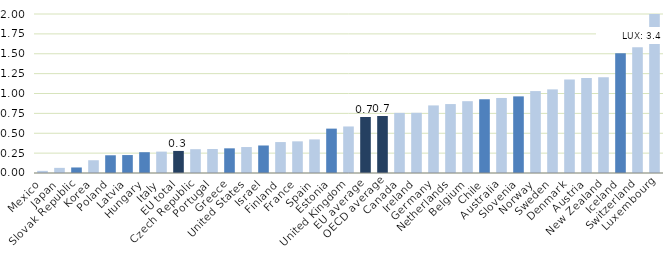
| Category | % |
|---|---|
| Mexico | 0.027 |
| Japan | 0.065 |
| Slovak Republic | 0 |
| Korea | 0.161 |
| Poland | 0 |
| Latvia | 0 |
| Hungary | 0 |
| Italy | 0.269 |
| EU total | 0 |
| Czech Republic | 0.3 |
| Portugal | 0.302 |
| Greece | 0 |
| United States | 0.327 |
| Israel | 0 |
| Finland | 0.389 |
| France | 0.398 |
| Spain | 0.423 |
| Estonia | 0 |
| United Kingdom | 0.585 |
| EU average | 0 |
| OECD average | 0 |
| Canada | 0.756 |
| Ireland | 0.758 |
| Germany | 0.85 |
| Netherlands | 0.867 |
| Belgium | 0.903 |
| Chile | 0 |
| Australia | 0.944 |
| Slovenia | 0 |
| Norway | 1.03 |
| Sweden | 1.052 |
| Denmark | 1.177 |
| Austria | 1.194 |
| New Zealand | 1.205 |
| Iceland | 0 |
| Switzerland | 1.582 |
| Luxembourg | 3.425 |